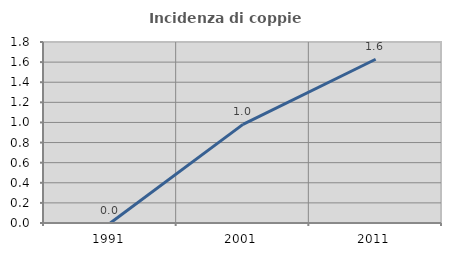
| Category | Incidenza di coppie miste |
|---|---|
| 1991.0 | 0 |
| 2001.0 | 0.98 |
| 2011.0 | 1.629 |